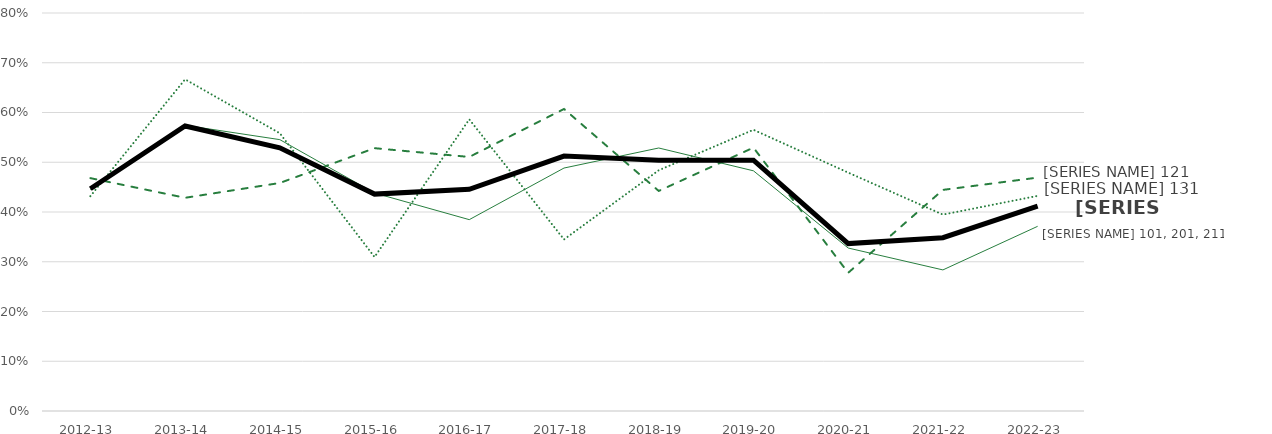
| Category | Communication arts | Crow studies | Math | Overall |
|---|---|---|---|---|
| 2012-13 | 0.445 | 0.432 | 0.468 | 0.447 |
| 2013-14 | 0.574 | 0.667 | 0.429 | 0.573 |
| 2014-15 | 0.545 | 0.558 | 0.458 | 0.529 |
| 2015-16 | 0.438 | 0.31 | 0.528 | 0.436 |
| 2016-17 | 0.385 | 0.586 | 0.511 | 0.446 |
| 2017-18 | 0.488 | 0.345 | 0.607 | 0.512 |
| 2018-19 | 0.529 | 0.484 | 0.442 | 0.504 |
| 2019-20 | 0.483 | 0.565 | 0.529 | 0.504 |
| 2020-21 | 0.328 | 0.479 | 0.278 | 0.337 |
| 2021-22 | 0.284 | 0.395 | 0.444 | 0.348 |
| 2022-23 | 0.371 | 0.432 | 0.469 | 0.412 |